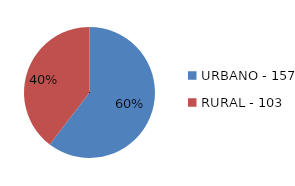
| Category | Series 0 |
|---|---|
| URBANO - 157 | 157 |
| RURAL - 103 | 103 |